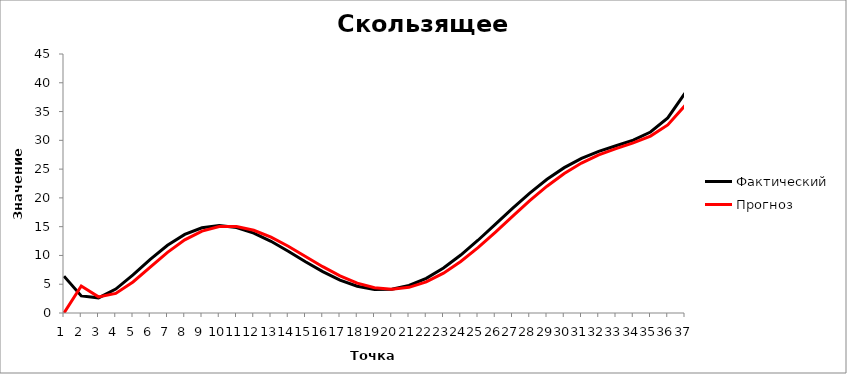
| Category | Фактический | Прогноз |
|---|---|---|
| 0 | 6.392 | 0 |
| 1 | 2.97 | 4.681 |
| 2 | 2.632 | 2.801 |
| 3 | 4.162 | 3.397 |
| 4 | 6.621 | 5.391 |
| 5 | 9.317 | 7.969 |
| 6 | 11.764 | 10.541 |
| 7 | 13.651 | 12.708 |
| 8 | 14.814 | 14.233 |
| 9 | 15.202 | 15.008 |
| 10 | 14.859 | 15.03 |
| 11 | 13.892 | 14.375 |
| 12 | 12.456 | 13.174 |
| 13 | 10.733 | 11.594 |
| 14 | 8.913 | 9.823 |
| 15 | 7.184 | 8.049 |
| 16 | 5.715 | 6.45 |
| 17 | 4.651 | 5.183 |
| 18 | 4.101 | 4.376 |
| 19 | 4.136 | 4.119 |
| 20 | 4.784 | 4.46 |
| 21 | 6.032 | 5.408 |
| 22 | 7.824 | 6.928 |
| 23 | 10.068 | 8.946 |
| 24 | 12.641 | 11.354 |
| 25 | 15.398 | 14.019 |
| 26 | 18.182 | 16.79 |
| 27 | 20.838 | 19.51 |
| 28 | 23.229 | 22.034 |
| 29 | 25.253 | 24.241 |
| 30 | 26.862 | 26.057 |
| 31 | 28.085 | 27.473 |
| 32 | 29.057 | 28.571 |
| 33 | 30.037 | 29.547 |
| 34 | 31.445 | 30.741 |
| 35 | 33.892 | 32.668 |
| 36 | 38.21 | 36.051 |